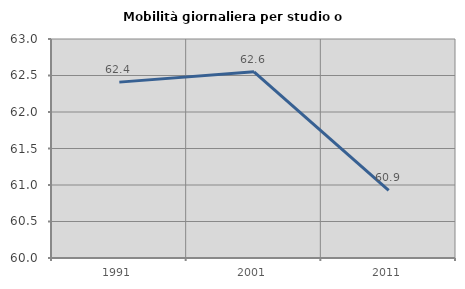
| Category | Mobilità giornaliera per studio o lavoro |
|---|---|
| 1991.0 | 62.409 |
| 2001.0 | 62.551 |
| 2011.0 | 60.925 |